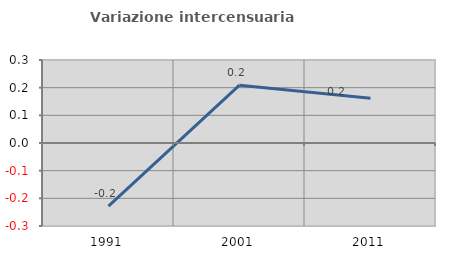
| Category | Variazione intercensuaria annua |
|---|---|
| 1991.0 | -0.228 |
| 2001.0 | 0.209 |
| 2011.0 | 0.162 |